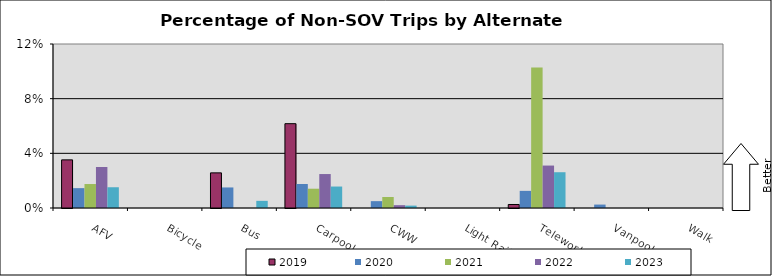
| Category | 2019 | 2020 | 2021 | 2022 | 2023 |
|---|---|---|---|---|---|
| AFV | 0.035 | 0.015 | 0.018 | 0.03 | 0.015 |
| Bicycle | 0 | 0 | 0 | 0 | 0 |
| Bus | 0.026 | 0.015 | 0 | 0 | 0.005 |
| Carpool | 0.062 | 0.018 | 0.014 | 0.025 | 0.016 |
| CWW | 0 | 0.005 | 0.008 | 0.002 | 0.002 |
| Light Rail | 0 | 0 | 0 | 0 | 0 |
| Telework | 0.003 | 0.013 | 0.103 | 0.031 | 0.026 |
| Vanpool | 0 | 0.003 | 0 | 0 | 0 |
| Walk | 0 | 0 | 0 | 0 | 0 |